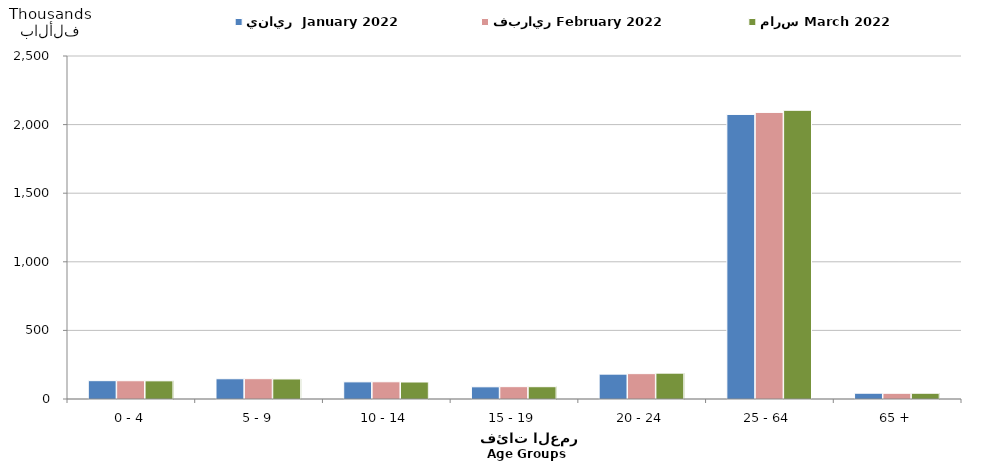
| Category | يناير  January 2022 | فبراير February 2022  | مارس March 2022  |
|---|---|---|---|
| 0 - 4 | 133486 | 133019 | 132335 |
| 5 - 9 | 147575 | 148141 | 146099 |
| 10 - 14 | 124917 | 125500 | 123841 |
| 15 - 19 | 88790 | 89885 | 89549 |
| 20 - 24 | 181083 | 184788 | 188298 |
| 25 - 64 | 2073961 | 2088811 | 2104248 |
| 65 + | 42113 | 41630 | 41916 |